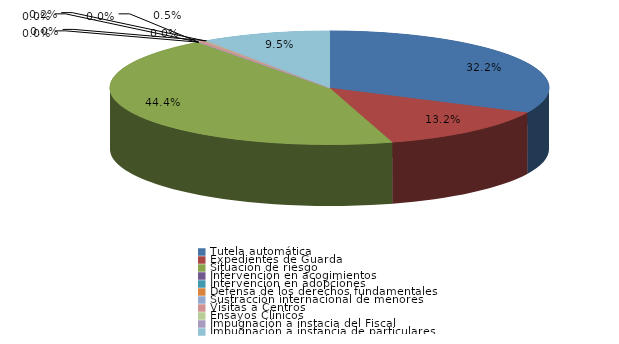
| Category | Series 0 |
|---|---|
| Tutela automática | 136 |
| Expedientes de Guarda | 56 |
| Situación de riesgo | 188 |
| Intervención en acogimientos | 0 |
| Intervención en adopciones | 0 |
| Defensa de los derechos fundamentales | 0 |
| Sustracción internacional de menores | 0 |
| Visitas a Centros | 2 |
| Ensayos Clínicos | 1 |
| Impugnación a instacia del Fiscal | 0 |
| Impugnación a instancia de particulares | 40 |